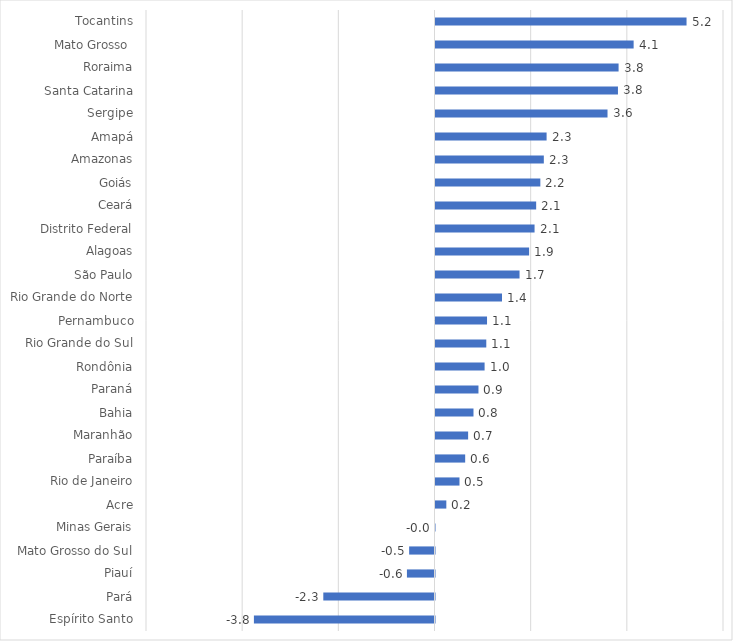
| Category | Series 0 |
|---|---|
| Tocantins | 5.221 |
| Mato Grosso  | 4.121 |
| Roraima | 3.808 |
| Santa Catarina | 3.795 |
| Sergipe | 3.578 |
| Amapá | 2.311 |
| Amazonas | 2.253 |
| Goiás | 2.18 |
| Ceará | 2.094 |
| Distrito Federal | 2.06 |
| Alagoas | 1.947 |
| São Paulo | 1.748 |
| Rio Grande do Norte | 1.383 |
| Pernambuco | 1.072 |
| Rio Grande do Sul | 1.056 |
| Rondônia | 1.021 |
| Paraná | 0.894 |
| Bahia | 0.79 |
| Maranhão | 0.679 |
| Paraíba | 0.617 |
| Rio de Janeiro | 0.499 |
| Acre | 0.225 |
| Minas Gerais | -0.005 |
| Mato Grosso do Sul | -0.527 |
| Piauí | -0.573 |
| Pará | -2.312 |
| Espírito Santo | -3.756 |